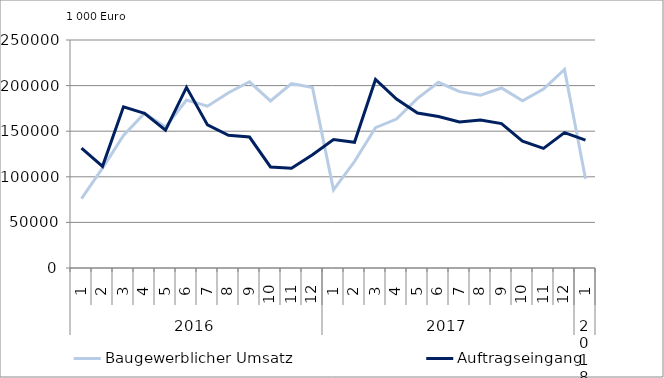
| Category | Baugewerblicher Umsatz | Auftragseingang |
|---|---|---|
| 0 | 76043.538 | 131571.482 |
| 1 | 109483.268 | 111467.248 |
| 2 | 145343.559 | 176673.268 |
| 3 | 169660.551 | 169566.96 |
| 4 | 154554.865 | 151228.165 |
| 5 | 184236.137 | 198035.655 |
| 6 | 177444.278 | 156900.898 |
| 7 | 192230.472 | 145537.167 |
| 8 | 204178.065 | 143616.217 |
| 9 | 183173.849 | 110770.94 |
| 10 | 202302.279 | 109384.188 |
| 11 | 197832.096 | 124193.91 |
| 12 | 85701.947 | 140751.008 |
| 13 | 116743.276 | 137863.383 |
| 14 | 153810.055 | 206710.579 |
| 15 | 163342.989 | 185183.797 |
| 16 | 185946.221 | 169878.51 |
| 17 | 203627.91 | 166148.392 |
| 18 | 193377.256 | 160134.206 |
| 19 | 189429.952 | 162221.206 |
| 20 | 197405.279 | 158305.285 |
| 21 | 183450.026 | 139156.761 |
| 22 | 196209.214 | 131165.419 |
| 23 | 217688.447 | 148434.901 |
| 24 | 97959.056 | 140119.385 |